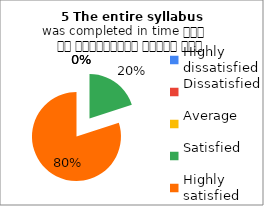
| Category | 5 The entire syllabus
was completed in time समय पर पाठ्यक्रम पूर्ण हुआ |
|---|---|
| Highly dissatisfied | 0 |
| Dissatisfied | 0 |
| Average | 0 |
| Satisfied | 3 |
| Highly satisfied | 12 |